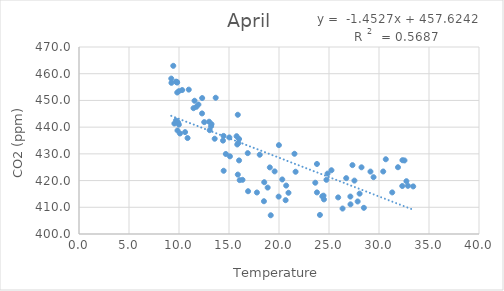
| Category | Series 0 |
|---|---|
| 10.607500000000016 | 438.137 |
| 10.096666666666977 | 437.627 |
| 9.989166666667018 | 440.958 |
| 9.91500000000002 | 441.749 |
| 9.849166666666974 | 438.745 |
| 9.536666666666974 | 441.347 |
| 9.696666666667 | 442.484 |
| 10.85583333333301 | 435.92 |
| 14.465833333333023 | 423.666 |
| 18.865833333333 | 417.377 |
| 25.917500000000018 | 413.696 |
| 32.327499999999986 | 417.963 |
| 32.74250000000001 | 419.759 |
| 33.42083333333301 | 417.814 |
| 32.89166666666699 | 418.029 |
| 31.32249999999999 | 415.569 |
| 27.136666666666997 | 414.018 |
| 26.356666666667024 | 409.53 |
| 24.45083333333298 | 414.353 |
| 20.71916666666698 | 418.133 |
| 20.94749999999999 | 415.426 |
| 19.56333333333299 | 423.438 |
| 19.964166666666983 | 413.991 |
| 18.493333333333 | 412.264 |
| 17.791666666667027 | 415.539 |
| 16.349166666666974 | 420.274 |
| 16.071666666667 | 420.17 |
| 15.880833333332987 | 422.242 |
| 14.68416666666701 | 429.952 |
| 13.569166666667002 | 435.66 |
| 13.070833333332985 | 438.866 |
| 13.252499999999998 | 441.115 |
| 15.095833333333019 | 429.069 |
| 16.907500000000027 | 416.009 |
| 19.17500000000001 | 407.012 |
| 24.090833333333023 | 407.137 |
| 27.149166666666986 | 411.103 |
| 27.866666666667015 | 412.178 |
| 24.329166666666993 | 414.099 |
| 28.488333333333003 | 409.799 |
| 28.06166666666701 | 415.1 |
| 24.493333333333 | 412.954 |
| 20.662500000000023 | 412.657 |
| 18.524166666666986 | 419.384 |
| 16.006666666667 | 427.543 |
| 13.670000000000016 | 450.998 |
| 12.316666666667004 | 450.883 |
| 12.304166666667015 | 445.133 |
| 13.208333333332973 | 440.347 |
| 10.976666666666972 | 454.041 |
| 9.985000000000014 | 453.461 |
| 9.824166666666997 | 452.966 |
| 9.696666666667 | 457.025 |
| 9.244166666667013 | 456.587 |
| 9.22750000000002 | 458.175 |
| 11.941666666667004 | 448.469 |
| 16.87416666666701 | 430.267 |
| 23.795000000000016 | 426.215 |
| 23.62833333333299 | 419.193 |
| 23.795000000000016 | 415.57 |
| 27.542500000000018 | 419.982 |
| 24.744166666667013 | 420.284 |
| 25.245000000000005 | 423.863 |
| 29.455833333332976 | 421.262 |
| 28.25 | 424.965 |
| 21.659166666666977 | 423.306 |
| 20.326666666666995 | 420.415 |
| 19.08166666666699 | 424.924 |
| 18.07499999999999 | 429.667 |
| 15.939166666667006 | 434.06 |
| 14.453333333332978 | 436.717 |
| 13.011666666666997 | 442.025 |
| 12.521666666666988 | 441.877 |
| 11.554166666667015 | 449.874 |
| 11.449999999999989 | 447.101 |
| 10.31583333333299 | 453.888 |
| 9.792500000000018 | 456.95 |
| 9.818333333332987 | 456.685 |
| 9.427500000000009 | 462.95 |
| 11.740833333333 | 447.622 |
| 16.004999999999995 | 435.56 |
| 21.547500000000014 | 430.028 |
| 27.345000000000027 | 425.786 |
| 29.146666666666988 | 423.359 |
| 30.423333333333005 | 423.397 |
| 31.896666666666988 | 424.99 |
| 32.548333333333005 | 427.532 |
| 26.722500000000025 | 420.905 |
| 32.34416666666698 | 427.62 |
| 30.679166666667015 | 427.978 |
| 24.857500000000016 | 422.61 |
| 19.990833333333 | 433.269 |
| 15.879999999999995 | 444.631 |
| 15.758333333332985 | 436.607 |
| 15.826666666666995 | 433.519 |
| 15.034166666666977 | 436.148 |
| 14.399999999999977 | 434.957 |